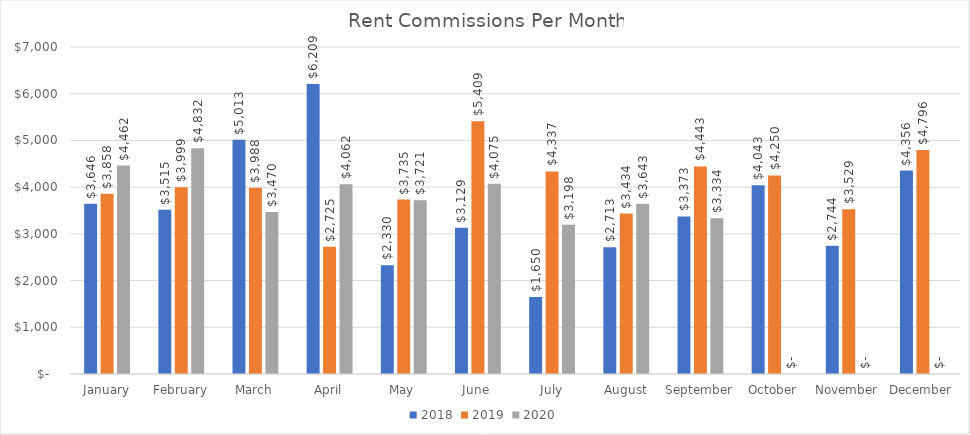
| Category | 2018 | 2019 | 2020 |
|---|---|---|---|
| January | 3645.5 | 3857.6 | 4462 |
| February | 3515 | 3998.5 | 4832 |
| March | 5013.1 | 3988 | 3469.91 |
| April | 6208.91 | 2725 | 4062.48 |
| May | 2330 | 3735 | 3720.5 |
| June | 3128.5 | 5408.5 | 4075 |
| July | 1650 | 4336.82 | 3197.5 |
| August | 2712.5 | 3434.06 | 3643 |
| September | 3373 | 4443 | 3334.01 |
| October | 4042.55 | 4250 | 0 |
| November | 2743.65 | 3528.5 | 0 |
| December | 4355.87 | 4795.5 | 0 |